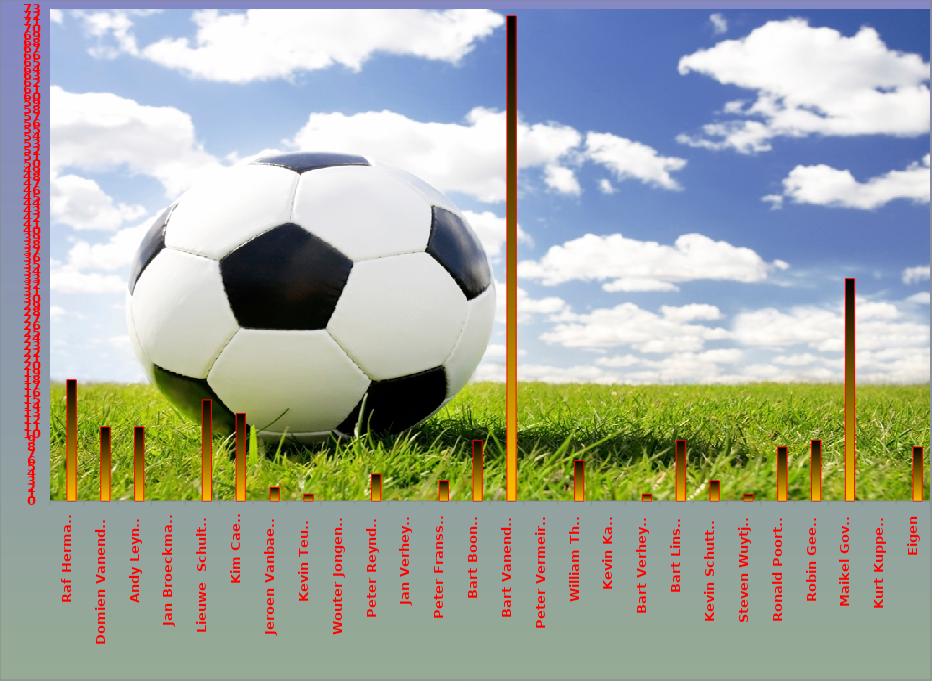
| Category | Series 0 | Series 1 |
|---|---|---|
| Raf Hermans |  | 18 |
| Domien Vanendert  |  | 11 |
| Andy Leynen |  | 11 |
| Jan Broeckmans |  | 0 |
| Lieuwe  Schultink |  | 15 |
| Kim Caels |  | 13 |
| Jeroen Vanbaelen |  | 2 |
| Kevin Teuwis |  | 1 |
| Wouter Jongeneel |  | 0 |
| Peter Reynders |  | 4 |
| Jan Verheyen |  | 0 |
| Peter Franssen |  | 3 |
| Bart Boonen |  | 9 |
| Bart Vanendert |  | 72 |
| Peter Vermeiren |  | 0 |
| William Thijs |  | 6 |
| Kevin Kalili |  | 0 |
| Bart Verheyen |  | 1 |
| Bart Linsen |  | 9 |
| Kevin Schutters |  | 3 |
| Steven Wuytjes |  | 1 |
| Ronald Poorters |  | 8 |
| Robin Geerts |  | 9 |
| Maikel Goven |  | 33 |
| Kurt Kuppens |  | 0 |
| Eigen |  | 8 |